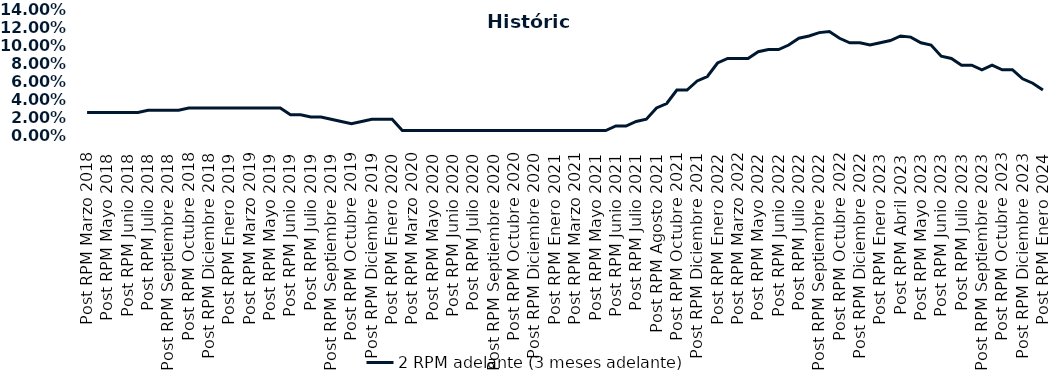
| Category | 2 RPM adelante (3 meses adelante) |
|---|---|
| Post RPM Marzo 2018 | 0.025 |
| Pre RPM Mayo 2018 | 0.025 |
| Post RPM Mayo 2018 | 0.025 |
| Pre RPM Junio 2018 | 0.025 |
| Post RPM Junio 2018 | 0.025 |
| Pre RPM Julio 2018 | 0.025 |
| Post RPM Julio 2018 | 0.028 |
| Pre RPM Septiembre 2018 | 0.028 |
| Post RPM Septiembre 2018 | 0.028 |
| Pre RPM Octubre 2018 | 0.028 |
| Post RPM Octubre 2018 | 0.03 |
| Pre RPM Diciembre 2018 | 0.03 |
| Post RPM Diciembre 2018 | 0.03 |
| Pre RPM Enero 2019 | 0.03 |
| Post RPM Enero 2019 | 0.03 |
| Pre RPM Marzo 2019 | 0.03 |
| Post RPM Marzo 2019 | 0.03 |
| Pre RPM Mayo 2019 | 0.03 |
| Post RPM Mayo 2019 | 0.03 |
| Pre RPM Junio 2019 | 0.03 |
| Post RPM Junio 2019 | 0.022 |
| Pre RPM Julio 2019 | 0.022 |
| Post RPM Julio 2019 | 0.02 |
| Pre RPM Septiembre 2019 | 0.02 |
| Post RPM Septiembre 2019 | 0.018 |
| Pre RPM Octubre 2019 | 0.015 |
| Post RPM Octubre 2019 | 0.012 |
| Pre RPM Diciembre 2019 | 0.015 |
| Post RPM Diciembre 2019 | 0.018 |
| Pre RPM Enero 2020 | 0.018 |
| Post RPM Enero 2020 | 0.018 |
| Pre RPM Marzo 2020 | 0.005 |
| Post RPM Marzo 2020 | 0.005 |
| Pre RPM Mayo 2020 | 0.005 |
| Post RPM Mayo 2020 | 0.005 |
| Pre RPM Junio 2020 | 0.005 |
| Post RPM Junio 2020 | 0.005 |
| Pre RPM Julio 2020 | 0.005 |
| Post RPM Julio 2020 | 0.005 |
| Pre RPM Septiembre 2020 | 0.005 |
| Post RPM Septiembre 2020 | 0.005 |
| Pre RPM Octubre 2020 | 0.005 |
| Post RPM Octubre 2020 | 0.005 |
| Pre RPM Diciembre 2020 | 0.005 |
| Post RPM Diciembre 2020 | 0.005 |
| Pre RPM Enero 2021 | 0.005 |
| Post RPM Enero 2021 | 0.005 |
| Pre RPM Marzo 2021 | 0.005 |
| Post RPM Marzo 2021 | 0.005 |
| Pre RPM Mayo 2021 | 0.005 |
| Post RPM Mayo 2021 | 0.005 |
| Pre RPM Junio 2021 | 0.005 |
| Post RPM Junio 2021 | 0.01 |
| Pre RPM Julio 2021 | 0.01 |
| Post RPM Julio 2021 | 0.015 |
| Pre RPM Agosto 2021 | 0.018 |
| Post RPM Agosto 2021 | 0.03 |
| Pre RPM Octubre 2021 | 0.035 |
| Post RPM Octubre 2021 | 0.05 |
| Pre RPM Diciembre 2021 | 0.05 |
| Post RPM Diciembre 2021 | 0.06 |
| Pre RPM Enero 2022 | 0.065 |
| Post RPM Enero 2022 | 0.08 |
| Pre RPM Marzo 2022 | 0.085 |
| Post RPM Marzo 2022 | 0.085 |
| Pre RPM Mayo 2022 | 0.085 |
| Post RPM Mayo 2022 | 0.092 |
| Pre RPM Junio 2022 | 0.095 |
| Post RPM Junio 2022 | 0.095 |
| Pre RPM Julio 2022 | 0.1 |
| Post RPM Julio 2022 | 0.108 |
| Pre RPM Septiembre 2022 | 0.11 |
| Post RPM Septiembre 2022 | 0.114 |
| Pre RPM Octubre 2022 | 0.115 |
| Post RPM Octubre 2022 | 0.108 |
| Pre RPM Diciembre 2022 | 0.102 |
| Post RPM Diciembre 2022 | 0.102 |
| Pre RPM Enero 2023 | 0.1 |
| Post RPM Enero 2023 | 0.102 |
| Pre RPM Abril 2023 | 0.105 |
| Post RPM Abril 2023 | 0.11 |
| Pre RPM Mayo 2023 | 0.109 |
| Post RPM Mayo 2023 | 0.102 |
| Pre RPM Junio 2023 | 0.1 |
| Post RPM Junio 2023 | 0.088 |
| Pre RPM Julio 2023 | 0.085 |
| Post RPM Julio 2023 | 0.078 |
| Pre RPM Septiembre 2023 | 0.078 |
| Post RPM Septiembre 2023 | 0.072 |
| Pre RPM Octubre 2023 | 0.078 |
| Post RPM Octubre 2023 | 0.072 |
| Pre RPM Diciembre 2023 | 0.072 |
| Post RPM Diciembre 2023 | 0.062 |
| Pre RPM Enero 2024 | 0.058 |
| Post RPM Enero 2024 | 0.05 |